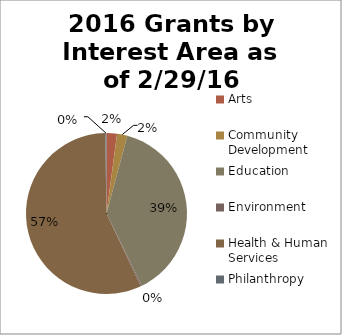
| Category | Series 0 |
|---|---|
| Arts | 4300 |
| Community Development | 4200 |
| Education | 78720 |
| Environment | 500 |
| Health & Human Services | 115800 |
| Philanthropy | 500 |